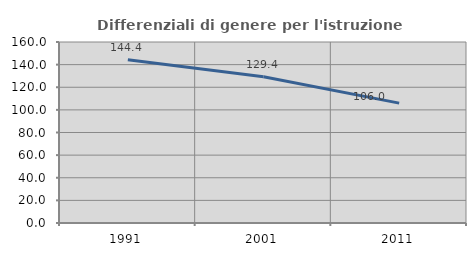
| Category | Differenziali di genere per l'istruzione superiore |
|---|---|
| 1991.0 | 144.368 |
| 2001.0 | 129.36 |
| 2011.0 | 105.971 |